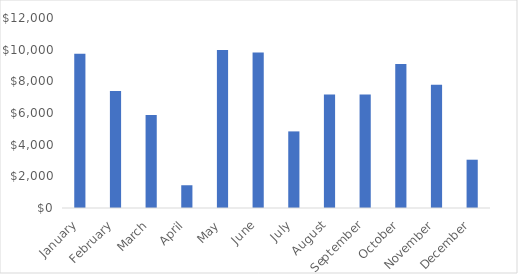
| Category | Series 0 |
|---|---|
| January | 9742 |
| February | 7389 |
| March | 5880 |
| April | 1437 |
| May | 9985 |
| June | 9825 |
| July | 4838 |
| August | 7161 |
| September | 7176 |
| October | 9094 |
| November | 7780 |
| December | 3050 |